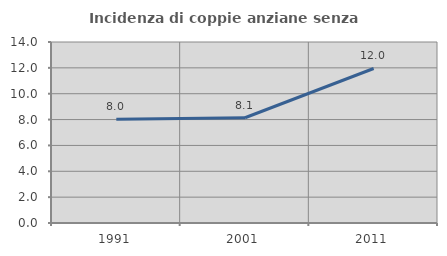
| Category | Incidenza di coppie anziane senza figli  |
|---|---|
| 1991.0 | 8.025 |
| 2001.0 | 8.142 |
| 2011.0 | 11.951 |